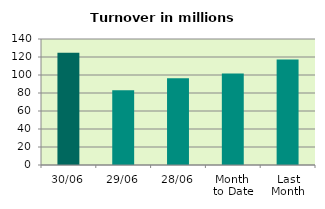
| Category | Series 0 |
|---|---|
| 30/06 | 124.686 |
| 29/06 | 83.193 |
| 28/06 | 96.336 |
| Month 
to Date | 101.544 |
| Last
Month | 117.306 |